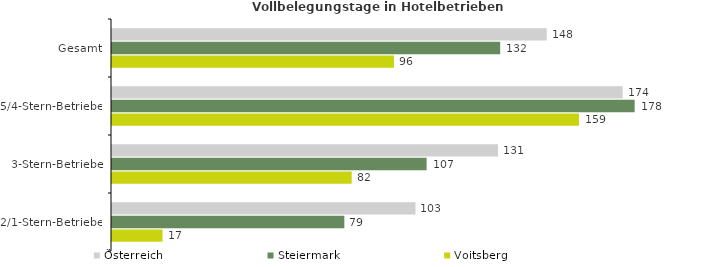
| Category | Österreich | Steiermark | Voitsberg |
|---|---|---|---|
| Gesamt | 147.876 | 132.038 | 95.91 |
| 5/4-Stern-Betriebe | 173.697 | 177.779 | 158.844 |
| 3-Stern-Betriebe | 131.294 | 107.011 | 81.53 |
| 2/1-Stern-Betriebe | 103.222 | 79.024 | 17.185 |